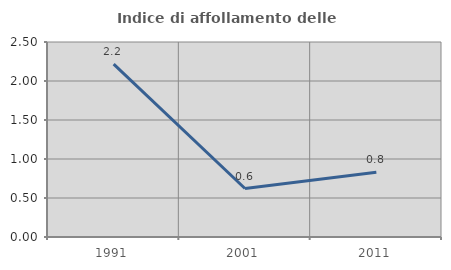
| Category | Indice di affollamento delle abitazioni  |
|---|---|
| 1991.0 | 2.216 |
| 2001.0 | 0.621 |
| 2011.0 | 0.829 |